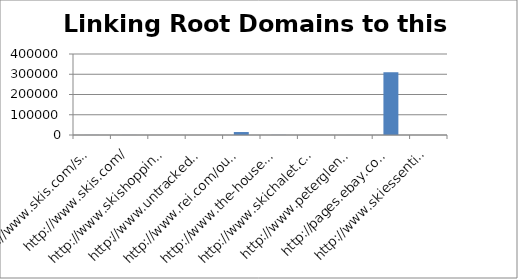
| Category | Linking Root Domains to this domain |
|---|---|
| http://www.skis.com/ski-equipment/c9/ | 280 |
| http://www.skis.com/ | 280 |
| http://www.skishoppingguide.com/ | 95 |
| http://www.untracked.com/ | 112 |
| http://www.rei.com/outlet/category/22000078 | 14656 |
| http://www.the-house.com/skis.html | 593 |
| http://www.skichalet.com/ | 90 |
| http://www.peterglenn.com/ | 235 |
| http://pages.ebay.com/buy/guides/skis-skiing-equipment-buying-guide/ | 309939 |
| http://www.skiessentials.com/ | 83 |